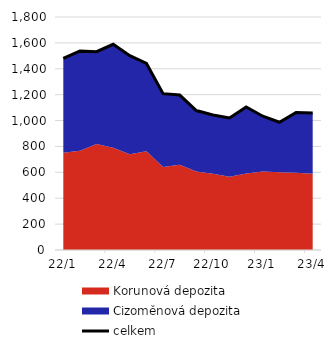
| Category | celkem |
|---|---|
| 2022-01-31 | 1479.746 |
| 2022-02-28 | 1538.154 |
| 2022-03-31 | 1532.45 |
| 2022-04-30 | 1589.362 |
| 2022-05-31 | 1501.328 |
| 2022-06-30 | 1441.246 |
| 2022-07-31 | 1207.672 |
| 2022-08-31 | 1197.189 |
| 2022-09-30 | 1077.34 |
| 2022-10-31 | 1043.138 |
| 2022-11-30 | 1019.847 |
| 2022-12-31 | 1105.122 |
| 2023-01-31 | 1033.251 |
| 2023-02-28 | 987.091 |
| 2023-03-31 | 1062.435 |
| 2023-04-30 | 1057.623 |